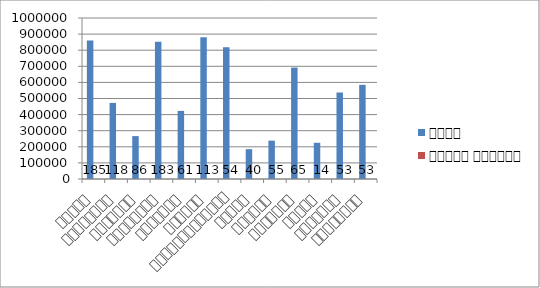
| Category | बजेट | योजना संख्या |
|---|---|---|
| चितवन | 860800 | 185 |
| मकवानपुर | 472650 | 118 |
| ललितपुर | 266500 | 86 |
| काठमाडौँ | 851800 | 183 |
| भक्तपुर | 422900 | 61 |
| काभ्रे | 880400 | 113 |
| सिन्धुपाल्चोक | 818800 | 54 |
| दोलखा | 185200 | 40 |
| धादिंग | 238200 | 55 |
| नुवाकोट | 692150 | 65 |
| रसुवा | 224800 | 14 |
| रामेछाप | 537200 | 53 |
| सिन्धुली | 584800 | 53 |